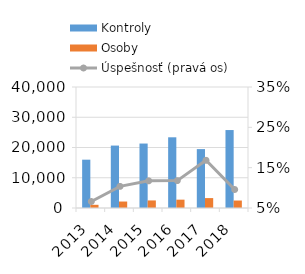
| Category | Kontroly | Osoby |
|---|---|---|
| 2013.0 | 15974 | 1056 |
| 2014.0 | 20638 | 2138 |
| 2015.0 | 21309 | 2501 |
| 2016.0 | 23372 | 2756 |
| 2017.0 | 19469 | 3275 |
| 2018.0 | 25769 | 2470 |